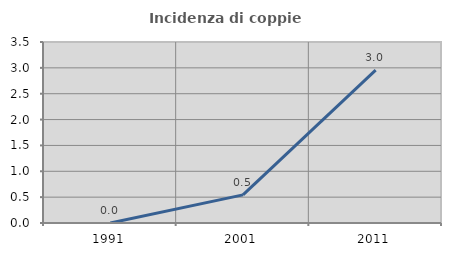
| Category | Incidenza di coppie miste |
|---|---|
| 1991.0 | 0 |
| 2001.0 | 0.543 |
| 2011.0 | 2.957 |